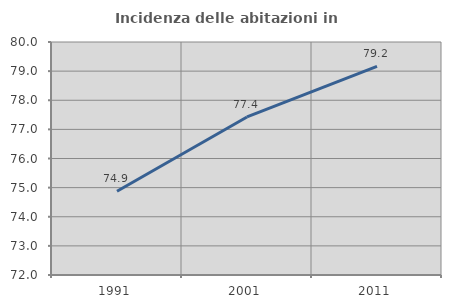
| Category | Incidenza delle abitazioni in proprietà  |
|---|---|
| 1991.0 | 74.873 |
| 2001.0 | 77.426 |
| 2011.0 | 79.161 |